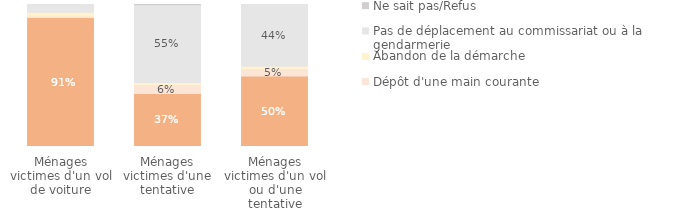
| Category | Dépôt de plainte | Dépôt d'une main courante | Abandon de la démarche | Pas de déplacement au commissariat ou à la gendarmerie | Ne sait pas/Refus |
|---|---|---|---|---|---|
| Ménages victimes d'un vol ou d'une tentative | 0.497 | 0.05 | 0.018 | 0.435 | 0 |
| Ménages victimes d'une tentative | 0.374 | 0.061 | 0.015 | 0.548 | 0.002 |
| Ménages victimes d'un vol de voiture | 0.908 | 0.011 | 0.026 | 0.055 | 0 |